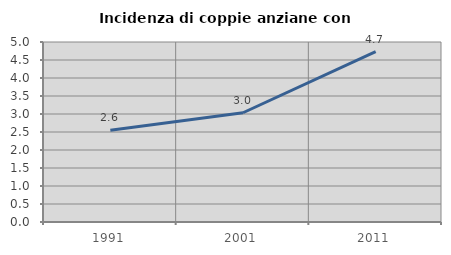
| Category | Incidenza di coppie anziane con figli |
|---|---|
| 1991.0 | 2.55 |
| 2001.0 | 3.035 |
| 2011.0 | 4.733 |